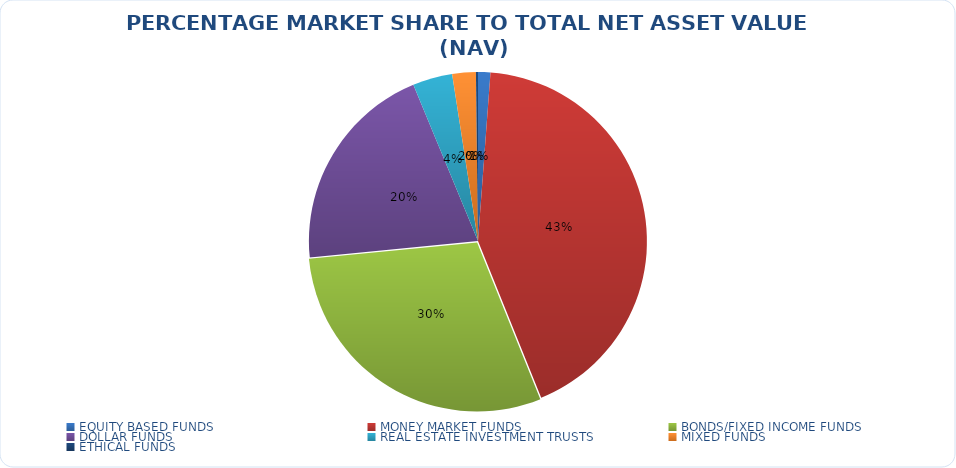
| Category | NET ASSET VALUE |
|---|---|
| EQUITY BASED FUNDS | 15426057289.61 |
| MONEY MARKET FUNDS | 558909333031.113 |
| BONDS/FIXED INCOME FUNDS | 386679246881.328 |
| DOLLAR FUNDS | 265570315703.238 |
| REAL ESTATE INVESTMENT TRUSTS | 49701376573.39 |
| MIXED FUNDS | 29461238398.707 |
| ETHICAL FUNDS | 2569132868.28 |